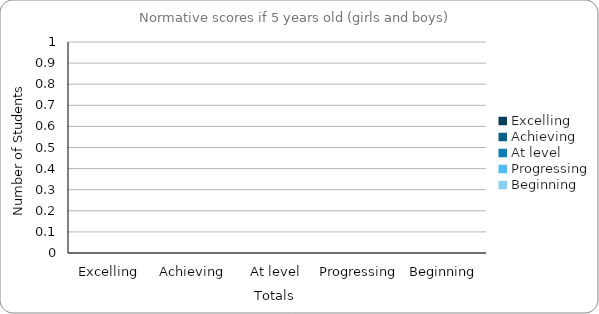
| Category | If 5 years old |
|---|---|
| Excelling | 0 |
| Achieving | 0 |
| At level | 0 |
| Progressing | 0 |
| Beginning | 0 |